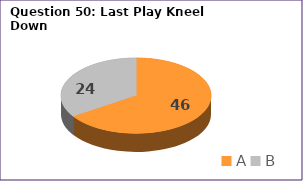
| Category | Series 0 |
|---|---|
| A | 46 |
| B | 24 |